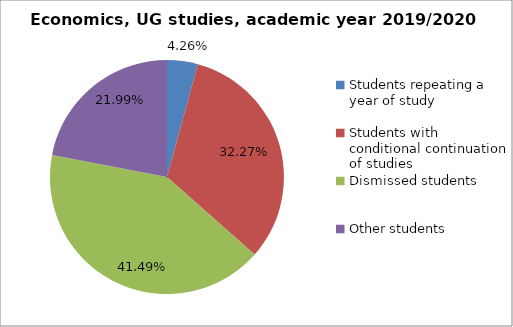
| Category | Series 0 |
|---|---|
| Students repeating a year of study | 12 |
| Students with conditional continuation of studies | 91 |
| Dismissed students | 117 |
| Other students | 62 |